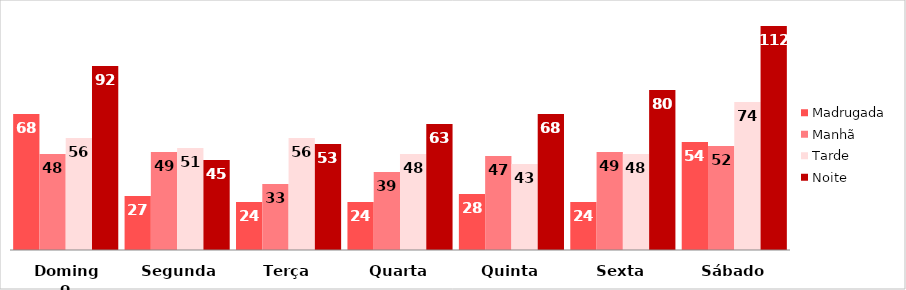
| Category | Madrugada | Manhã | Tarde | Noite |
|---|---|---|---|---|
| Domingo | 68 | 48 | 56 | 92 |
| Segunda | 27 | 49 | 51 | 45 |
| Terça | 24 | 33 | 56 | 53 |
| Quarta | 24 | 39 | 48 | 63 |
| Quinta | 28 | 47 | 43 | 68 |
| Sexta | 24 | 49 | 48 | 80 |
| Sábado | 54 | 52 | 74 | 112 |